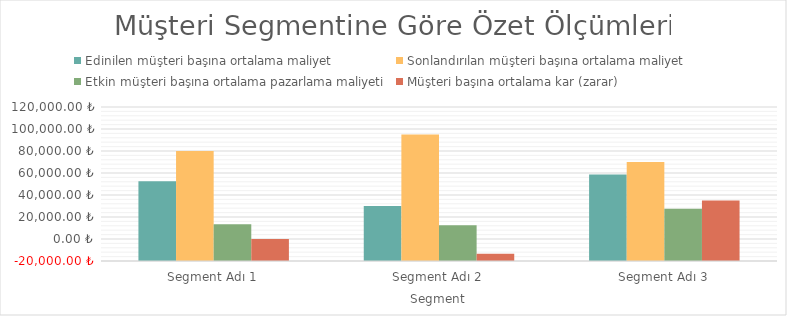
| Category | Edinilen müşteri başına ortalama maliyet | Sonlandırılan müşteri başına ortalama maliyet | Etkin müşteri başına ortalama pazarlama maliyeti | Müşteri başına ortalama kar (zarar) |
|---|---|---|---|---|
| Segment Adı 1 | 52500 | 80000 | 13333.333 | 0 |
| Segment Adı 2 | 30000 | 95000 | 12500 | -13500 |
| Segment Adı 3 | 58750 | 70000 | 27500 | 35000 |